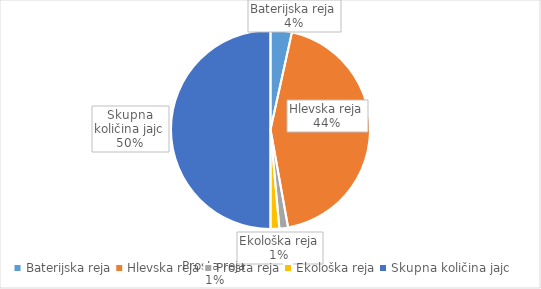
| Category | Količina kosov jajc |
|---|---|
| Baterijska reja | 246428 |
| Hlevska reja | 3121367 |
| Prosta reja | 100581 |
| Ekološka reja | 101684 |
| Skupna količina jajc | 3570060 |